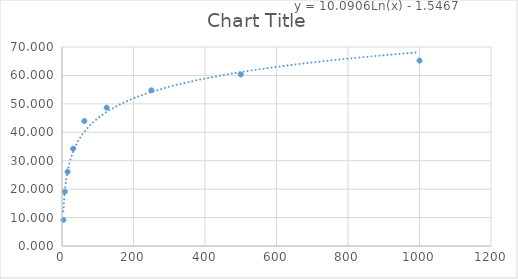
| Category | Series 0 |
|---|---|
| 3.91 | 9.189 |
| 7.81 | 19.099 |
| 15.62 | 26.126 |
| 31.25 | 34.234 |
| 62.5 | 43.964 |
| 125.0 | 48.649 |
| 250.0 | 54.775 |
| 500.0 | 60.36 |
| 1000.0 | 65.225 |